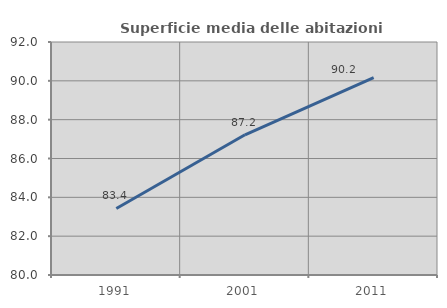
| Category | Superficie media delle abitazioni occupate |
|---|---|
| 1991.0 | 83.426 |
| 2001.0 | 87.221 |
| 2011.0 | 90.166 |